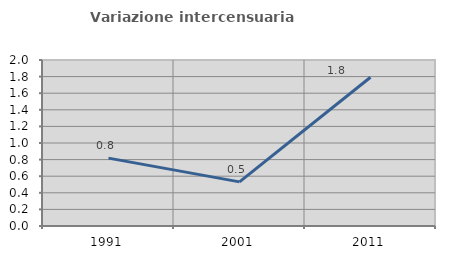
| Category | Variazione intercensuaria annua |
|---|---|
| 1991.0 | 0.818 |
| 2001.0 | 0.531 |
| 2011.0 | 1.792 |